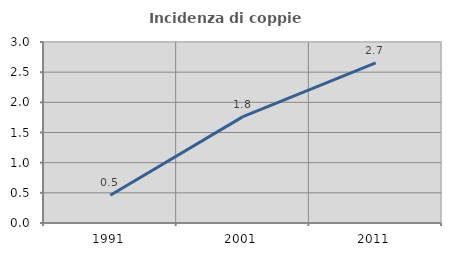
| Category | Incidenza di coppie miste |
|---|---|
| 1991.0 | 0.46 |
| 2001.0 | 1.763 |
| 2011.0 | 2.653 |